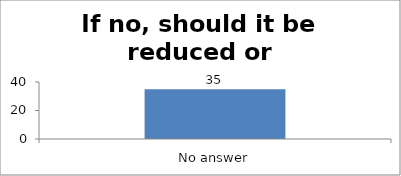
| Category | If no, should it be reduced or increased |
|---|---|
| No answer | 35 |